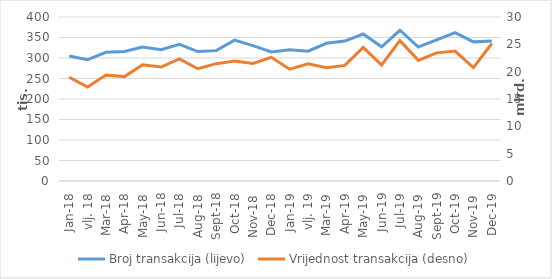
| Category | Broj transakcija (lijevo) |
|---|---|
| sij.18 | 304710 |
| vlj. 18 | 295986 |
| ožu.18 | 313813 |
| tra.18 | 315914 |
| svi.18 | 326704 |
| lip.18 | 320449 |
| srp.18 | 333557 |
| kol.18 | 315639 |
| ruj.18 | 317944 |
| lis.18 | 343641 |
| stu.18 | 330355 |
| pro.18 | 314597 |
| sij.19 | 320078 |
| vlj. 19 | 316492 |
| ožu.19 | 335948 |
| tra.19 | 341258 |
| svi.19 | 358577 |
| lip.19 | 327234 |
| srp.19 | 367649 |
| kol.19 | 326772 |
| ruj.19 | 344040 |
| lis.19 | 361767 |
| stu.19 | 339353 |
| pro.19 | 341408 |